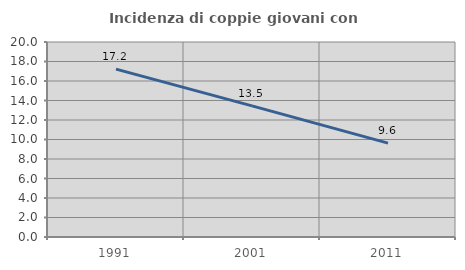
| Category | Incidenza di coppie giovani con figli |
|---|---|
| 1991.0 | 17.219 |
| 2001.0 | 13.453 |
| 2011.0 | 9.627 |